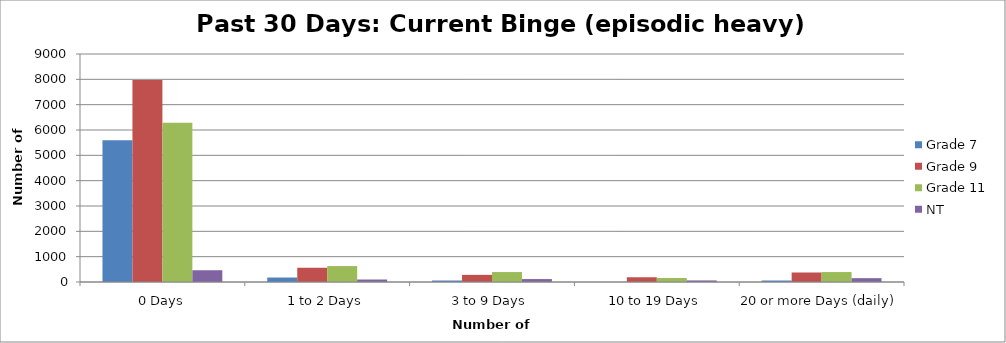
| Category | Grade 7 | Grade 9 | Grade 11 | NT |
|---|---|---|---|---|
| 0 Days | 5598.35 | 7972.15 | 6285.6 | 464.36 |
| 1 to 2 Days | 176.79 | 562.74 | 628.56 | 98.23 |
| 3 to 9 Days | 58.93 | 281.37 | 392.85 | 116.09 |
| 10 to 19 Days | 0 | 187.58 | 157.14 | 62.51 |
| 20 or more Days (daily) | 58.93 | 375.16 | 392.85 | 151.81 |